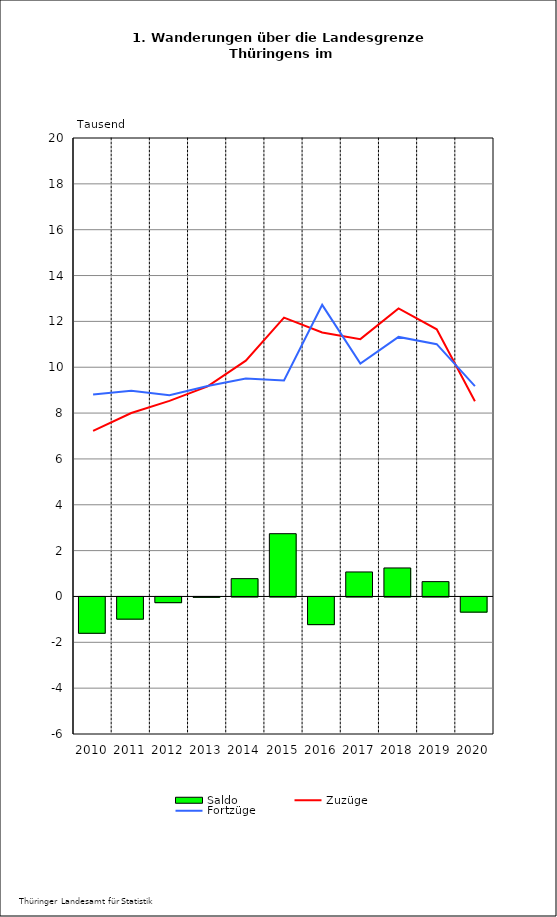
| Category | Saldo |
|---|---|
| 2010.0 | -1.585 |
| 2011.0 | -0.968 |
| 2012.0 | -0.249 |
| 2013.0 | -0.016 |
| 2014.0 | 0.777 |
| 2015.0 | 2.738 |
| 2016.0 | -1.207 |
| 2017.0 | 1.069 |
| 2018.0 | 1.243 |
| 2019.0 | 0.647 |
| 2020.0 | -0.662 |